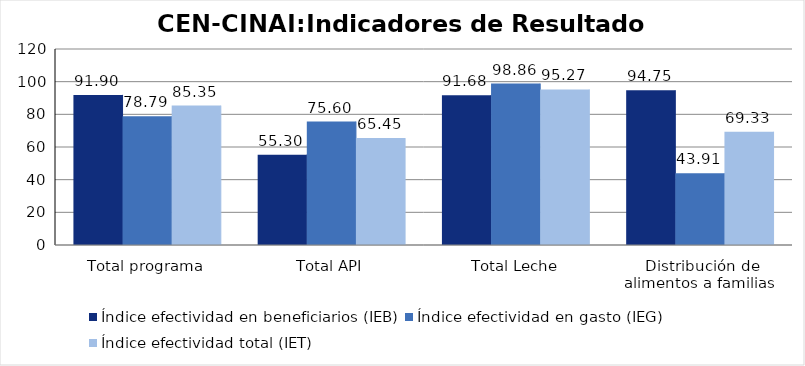
| Category | Índice efectividad en beneficiarios (IEB) | Índice efectividad en gasto (IEG)  | Índice efectividad total (IET) |
|---|---|---|---|
| Total programa | 91.905 | 78.79 | 85.347 |
| Total API | 55.3 | 75.595 | 65.448 |
| Total Leche | 91.679 | 98.856 | 95.268 |
| Distribución de alimentos a familias  | 94.747 | 43.915 | 69.331 |